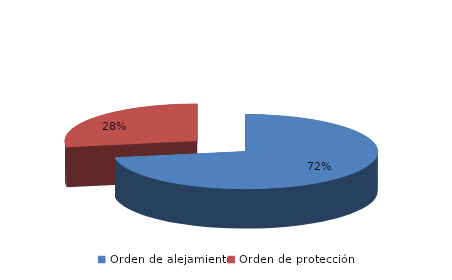
| Category | Series 0 |
|---|---|
| Orden de alejamiento | 1984 |
| Orden de protección | 759 |